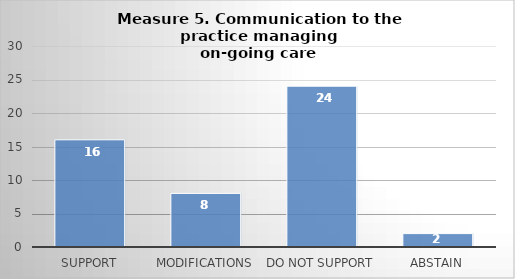
| Category | Series 0 |
|---|---|
| Support | 16 |
| Modifications | 8 |
| Do not support | 24 |
| Abstain | 2 |